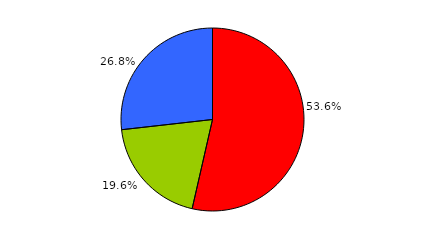
| Category | Series 0 |
|---|---|
| 0 | 150 |
| 1 | 55 |
| 2 | 75 |